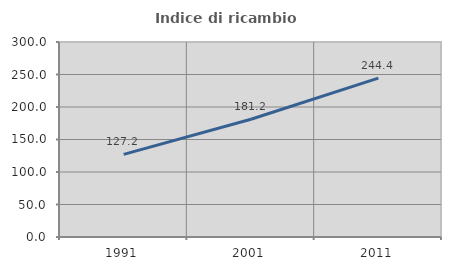
| Category | Indice di ricambio occupazionale  |
|---|---|
| 1991.0 | 127.152 |
| 2001.0 | 181.199 |
| 2011.0 | 244.386 |